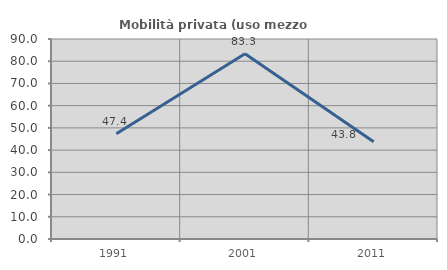
| Category | Mobilità privata (uso mezzo privato) |
|---|---|
| 1991.0 | 47.368 |
| 2001.0 | 83.333 |
| 2011.0 | 43.75 |